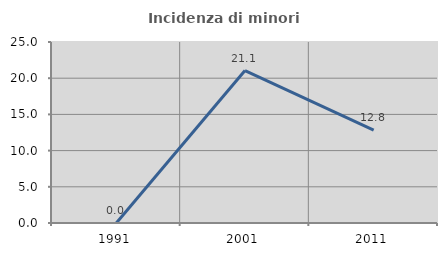
| Category | Incidenza di minori stranieri |
|---|---|
| 1991.0 | 0 |
| 2001.0 | 21.053 |
| 2011.0 | 12.821 |